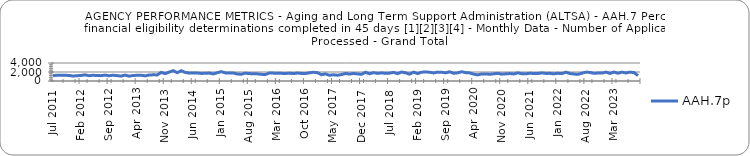
| Category | AAH.7p |
|---|---|
| 2011-07-01 | 1172 |
| 2011-08-01 | 1302 |
| 2011-09-01 | 1293 |
| 2011-10-01 | 1276 |
| 2011-11-01 | 1234 |
| 2011-12-01 | 1100 |
| 2012-01-01 | 1176 |
| 2012-02-01 | 1229 |
| 2012-03-01 | 1370 |
| 2012-04-01 | 1177 |
| 2012-05-01 | 1273 |
| 2012-06-01 | 1206 |
| 2012-07-01 | 1192 |
| 2012-08-01 | 1313 |
| 2012-09-01 | 1168 |
| 2012-10-01 | 1282 |
| 2012-11-01 | 1200 |
| 2012-12-01 | 1081 |
| 2013-01-01 | 1320 |
| 2013-02-01 | 1075 |
| 2013-03-01 | 1221 |
| 2013-04-01 | 1270 |
| 2013-05-01 | 1291 |
| 2013-06-01 | 1140 |
| 2013-07-01 | 1326 |
| 2013-08-01 | 1373 |
| 2013-09-01 | 1350 |
| 2013-10-01 | 1906 |
| 2013-11-01 | 1633 |
| 2013-12-01 | 1989 |
| 2014-01-01 | 2295 |
| 2014-02-01 | 1847 |
| 2014-03-01 | 2296 |
| 2014-04-01 | 1901 |
| 2014-05-01 | 1763 |
| 2014-06-01 | 1788 |
| 2014-07-01 | 1767 |
| 2014-08-01 | 1681 |
| 2014-09-01 | 1718 |
| 2014-10-01 | 1759 |
| 2014-11-01 | 1574 |
| 2014-12-01 | 1842 |
| 2015-01-01 | 2080 |
| 2015-02-01 | 1801 |
| 2015-03-01 | 1775 |
| 2015-04-01 | 1780 |
| 2015-05-01 | 1549 |
| 2015-06-01 | 1507 |
| 2015-07-01 | 1748 |
| 2015-08-01 | 1642 |
| 2015-09-01 | 1621 |
| 2015-10-01 | 1585 |
| 2015-11-01 | 1479 |
| 2015-12-01 | 1449 |
| 2016-01-01 | 1772 |
| 2016-02-01 | 1749 |
| 2016-03-01 | 1729 |
| 2016-04-01 | 1701 |
| 2016-05-01 | 1655 |
| 2016-06-01 | 1740 |
| 2016-07-01 | 1641 |
| 2016-08-01 | 1766 |
| 2016-09-01 | 1682 |
| 2016-10-01 | 1666 |
| 2016-11-01 | 1808 |
| 2016-12-01 | 1939 |
| 2017-01-01 | 1846 |
| 2017-02-01 | 1391 |
| 2017-03-01 | 1574 |
| 2017-04-01 | 1276 |
| 2017-05-01 | 1383 |
| 2017-06-01 | 1285 |
| 2017-07-01 | 1429 |
| 2017-08-01 | 1671 |
| 2017-09-01 | 1538 |
| 2017-10-01 | 1669 |
| 2017-11-01 | 1578 |
| 2017-12-01 | 1481 |
| 2018-01-01 | 1929 |
| 2018-02-01 | 1604 |
| 2018-03-01 | 1858 |
| 2018-04-01 | 1693 |
| 2018-05-01 | 1791 |
| 2018-06-01 | 1714 |
| 2018-07-01 | 1750 |
| 2018-08-01 | 1919 |
| 2018-09-01 | 1625 |
| 2018-10-01 | 1999 |
| 2018-11-01 | 1808 |
| 2018-12-01 | 1529 |
| 2019-01-01 | 1969 |
| 2019-02-01 | 1643 |
| 2019-03-01 | 1962 |
| 2019-04-01 | 1994 |
| 2019-05-01 | 1957 |
| 2019-06-01 | 1785 |
| 2019-07-01 | 1974 |
| 2019-08-01 | 1945 |
| 2019-09-01 | 1806 |
| 2019-10-01 | 2041 |
| 2019-11-01 | 1720 |
| 2019-12-01 | 1815 |
| 2020-01-01 | 2063 |
| 2020-02-01 | 1853 |
| 2020-03-01 | 1794 |
| 2020-04-01 | 1519 |
| 2020-05-01 | 1360 |
| 2020-06-01 | 1567 |
| 2020-07-01 | 1578 |
| 2020-08-01 | 1502 |
| 2020-09-01 | 1595 |
| 2020-10-01 | 1703 |
| 2020-11-01 | 1518 |
| 2020-12-01 | 1596 |
| 2021-01-01 | 1649 |
| 2021-02-01 | 1567 |
| 2021-03-01 | 1811 |
| 2021-04-01 | 1631 |
| 2021-05-01 | 1593 |
| 2021-06-01 | 1725 |
| 2021-07-01 | 1668 |
| 2021-08-01 | 1665 |
| 2021-09-01 | 1797 |
| 2021-10-01 | 1690 |
| 2021-11-01 | 1697 |
| 2021-12-01 | 1591 |
| 2022-01-01 | 1714 |
| 2022-02-01 | 1636 |
| 2022-03-01 | 1963 |
| 2022-04-01 | 1653 |
| 2022-05-01 | 1558 |
| 2022-06-01 | 1479 |
| 2022-07-01 | 1726 |
| 2022-08-01 | 1965 |
| 2022-09-01 | 1902 |
| 2022-10-01 | 1710 |
| 2022-11-01 | 1767 |
| 2022-12-01 | 1756 |
| 2023-01-01 | 1978 |
| 2023-02-01 | 1673 |
| 2023-03-01 | 1999 |
| 2023-04-01 | 1726 |
| 2023-05-01 | 1971 |
| 2023-06-01 | 1781 |
| 2023-07-01 | 1975 |
| 2023-08-01 | 1880 |
| 2023-09-01 | 1208 |